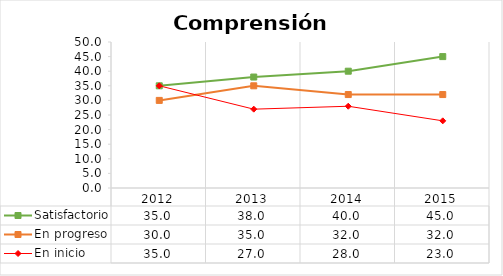
| Category | Satisfactorio | En progreso | En inicio |
|---|---|---|---|
| 0 | 35 | 30 | 35 |
| 1 | 38 | 35 | 27 |
| 2 | 40 | 32 | 28 |
| 3 | 45 | 32 | 23 |